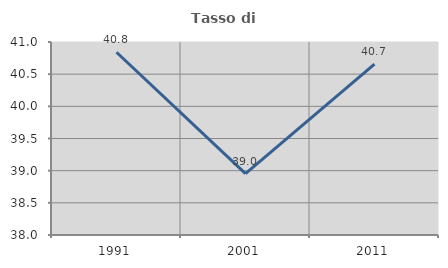
| Category | Tasso di occupazione   |
|---|---|
| 1991.0 | 40.841 |
| 2001.0 | 38.953 |
| 2011.0 | 40.655 |